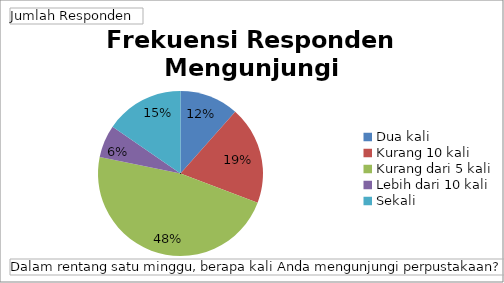
| Category | Total |
|---|---|
| Dua kali | 9 |
| Kurang 10 kali | 15 |
| Kurang dari 5 kali | 37 |
| Lebih dari 10 kali | 5 |
| Sekali | 12 |